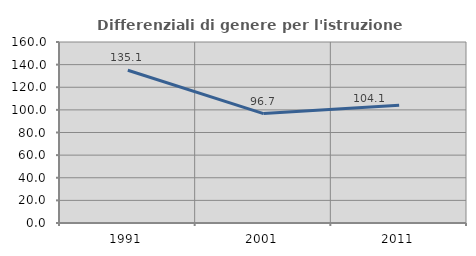
| Category | Differenziali di genere per l'istruzione superiore |
|---|---|
| 1991.0 | 135.073 |
| 2001.0 | 96.728 |
| 2011.0 | 104.063 |